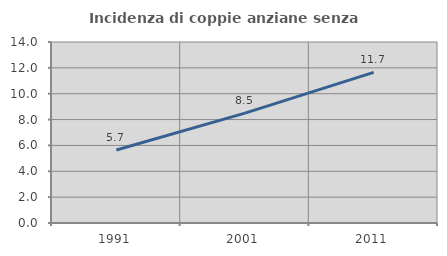
| Category | Incidenza di coppie anziane senza figli  |
|---|---|
| 1991.0 | 5.651 |
| 2001.0 | 8.499 |
| 2011.0 | 11.655 |